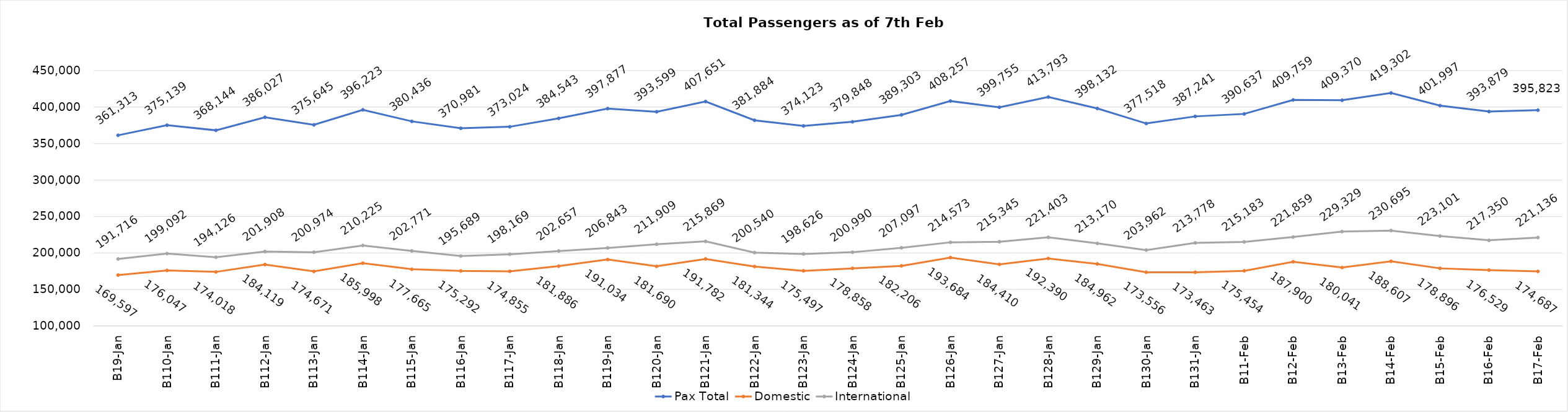
| Category | Pax Total | Domestic | International |
|---|---|---|---|
| 2024-01-09 | 361313 | 169597 | 191716 |
| 2024-01-10 | 375139 | 176047 | 199092 |
| 2024-01-11 | 368144 | 174018 | 194126 |
| 2024-01-12 | 386027 | 184119 | 201908 |
| 2024-01-13 | 375645 | 174671 | 200974 |
| 2024-01-14 | 396223 | 185998 | 210225 |
| 2024-01-15 | 380436 | 177665 | 202771 |
| 2024-01-16 | 370981 | 175292 | 195689 |
| 2024-01-17 | 373024 | 174855 | 198169 |
| 2024-01-18 | 384543 | 181886 | 202657 |
| 2024-01-19 | 397877 | 191034 | 206843 |
| 2024-01-20 | 393599 | 181690 | 211909 |
| 2024-01-21 | 407651 | 191782 | 215869 |
| 2024-01-22 | 381884 | 181344 | 200540 |
| 2024-01-23 | 374123 | 175497 | 198626 |
| 2024-01-24 | 379848 | 178858 | 200990 |
| 2024-01-25 | 389303 | 182206 | 207097 |
| 2024-01-26 | 408257 | 193684 | 214573 |
| 2024-01-27 | 399755 | 184410 | 215345 |
| 2024-01-28 | 413793 | 192390 | 221403 |
| 2024-01-29 | 398132 | 184962 | 213170 |
| 2024-01-30 | 377518 | 173556 | 203962 |
| 2024-01-31 | 387241 | 173463 | 213778 |
| 2024-02-01 | 390637 | 175454 | 215183 |
| 2024-02-02 | 409759 | 187900 | 221859 |
| 2024-02-03 | 409370 | 180041 | 229329 |
| 2024-02-04 | 419302 | 188607 | 230695 |
| 2024-02-05 | 401997 | 178896 | 223101 |
| 2024-02-06 | 393879 | 176529 | 217350 |
| 2024-02-07 | 395823 | 174687 | 221136 |